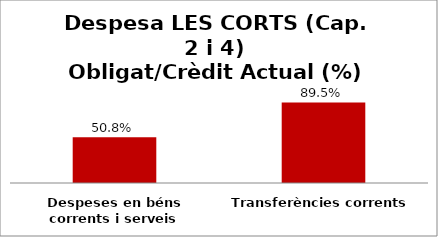
| Category | Series 0 |
|---|---|
| Despeses en béns corrents i serveis | 0.508 |
| Transferències corrents | 0.895 |